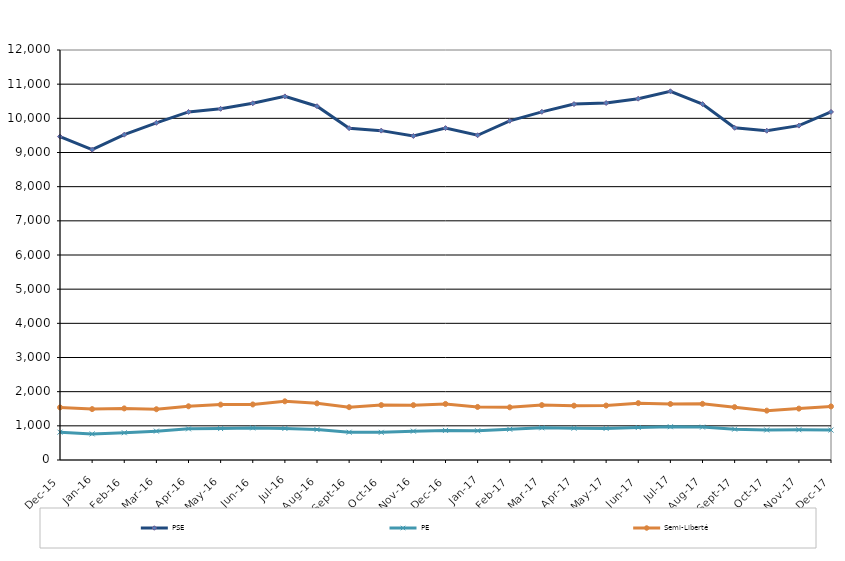
| Category | PSE | PE | Semi-Liberté |
|---|---|---|---|
| 2015-12-01 | 9466 | 815 | 1539 |
| 2016-01-01 | 9081 | 764 | 1490 |
| 2016-02-01 | 9521 | 798 | 1510 |
| 2016-03-01 | 9868 | 845 | 1486 |
| 2016-04-01 | 10187 | 912 | 1572 |
| 2016-05-01 | 10278 | 920 | 1621 |
| 2016-06-01 | 10441 | 939 | 1625 |
| 2016-07-01 | 10642 | 923 | 1718 |
| 2016-08-01 | 10355 | 890 | 1658 |
| 2016-09-01 | 9712 | 813 | 1546 |
| 2016-10-01 | 9640 | 809 | 1607 |
| 2016-11-01 | 9484 | 844 | 1605 |
| 2016-12-01 | 9714 | 866 | 1641 |
| 2017-01-01 | 9505 | 855 | 1553 |
| 2017-02-01 | 9927 | 900 | 1542 |
| 2017-03-01 | 10190 | 942 | 1607 |
| 2017-04-01 | 10417 | 931 | 1590 |
| 2017-05-01 | 10448 | 924 | 1594 |
| 2017-06-01 | 10575 | 951 | 1664 |
| 2017-07-01 | 10791 | 974 | 1639 |
| 2017-08-01 | 10417 | 963 | 1644 |
| 2017-09-01 | 9723 | 903 | 1547 |
| 2017-10-01 | 9637 | 879 | 1445 |
| 2017-11-01 | 9787 | 885 | 1504 |
| 2017-12-01 | 10187 | 876 | 1568 |